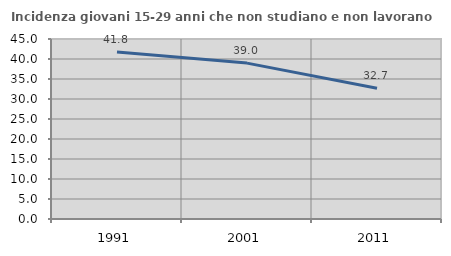
| Category | Incidenza giovani 15-29 anni che non studiano e non lavorano  |
|---|---|
| 1991.0 | 41.763 |
| 2001.0 | 38.973 |
| 2011.0 | 32.704 |